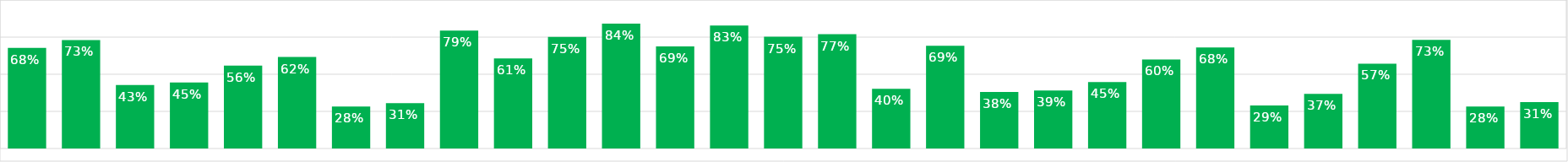
| Category | Series 0 |
|---|---|
| XAUUSD | 0.677 |
| AUDCAD | 0.73 |
| AUDCHF | 0.427 |
| AUDJPY | 0.445 |
| AUDNZD | 0.558 |
| AUDUSD | 0.616 |
| CADCHF | 0.283 |
| CADJPY | 0.306 |
| CHFJPY | 0.794 |
| EURAUD | 0.606 |
| EURCAD | 0.751 |
| EURCHF | 0.841 |
| EURGBP | 0.687 |
| EURJPY | 0.828 |
| EURNZD | 0.753 |
| EURUSD | 0.77 |
| GBPAUD | 0.403 |
| GBPCAD | 0.692 |
| GBPCHF | 0.38 |
| GBPJPY | 0.39 |
| GBPNZD | 0.448 |
| GBPUSD | 0.6 |
| NZDCAD | 0.68 |
| NZDCHF | 0.29 |
| NZDJPY | 0.367 |
| NZDUSD | 0.571 |
| USDCAD | 0.731 |
| USDCHF | 0.283 |
| USDJPY | 0.313 |